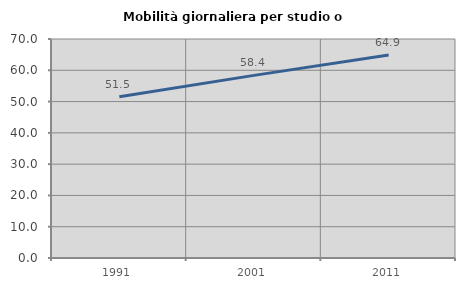
| Category | Mobilità giornaliera per studio o lavoro |
|---|---|
| 1991.0 | 51.52 |
| 2001.0 | 58.373 |
| 2011.0 | 64.886 |